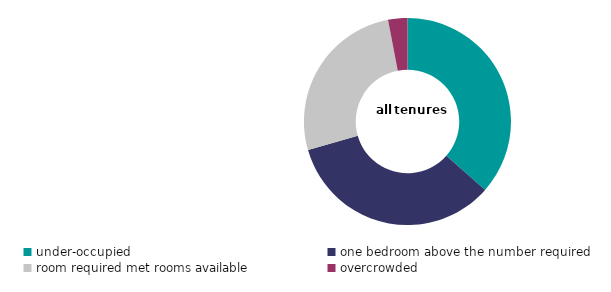
| Category | all tenures |
|---|---|
| under-occupied | 36.499 |
| one bedroom above the number required | 34.051 |
| room required met rooms available | 26.434 |
| overcrowded | 3.016 |